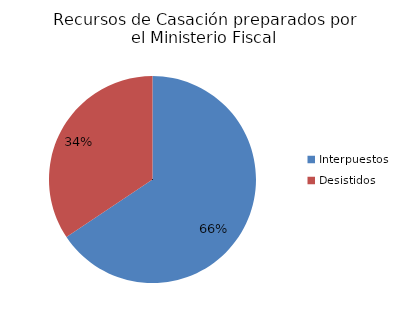
| Category | Series 0 |
|---|---|
| Interpuestos | 63 |
| Desistidos | 33 |